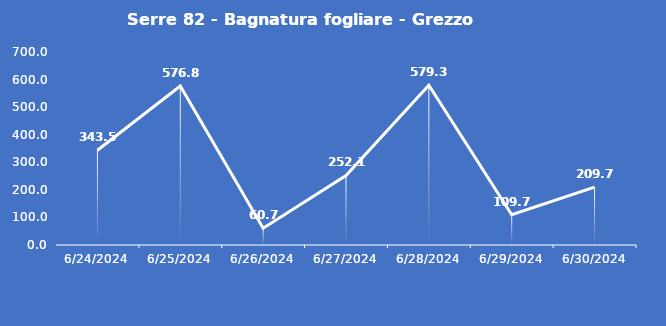
| Category | Serre 82 - Bagnatura fogliare - Grezzo (min) |
|---|---|
| 6/24/24 | 343.5 |
| 6/25/24 | 576.8 |
| 6/26/24 | 60.7 |
| 6/27/24 | 252.1 |
| 6/28/24 | 579.3 |
| 6/29/24 | 109.7 |
| 6/30/24 | 209.7 |